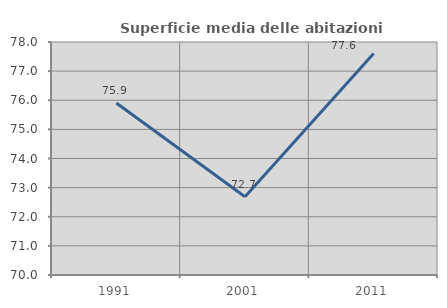
| Category | Superficie media delle abitazioni occupate |
|---|---|
| 1991.0 | 75.906 |
| 2001.0 | 72.688 |
| 2011.0 | 77.604 |